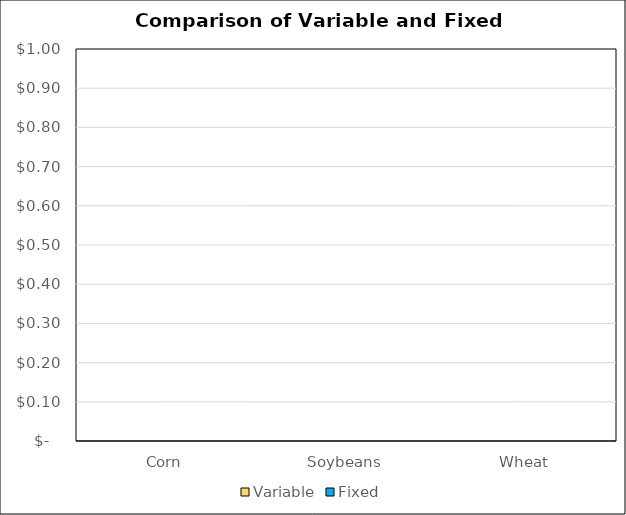
| Category | Variable | Fixed |
|---|---|---|
| Corn | 0 | 0 |
| Soybeans | 0 | 0 |
| Wheat | 0 | 0 |